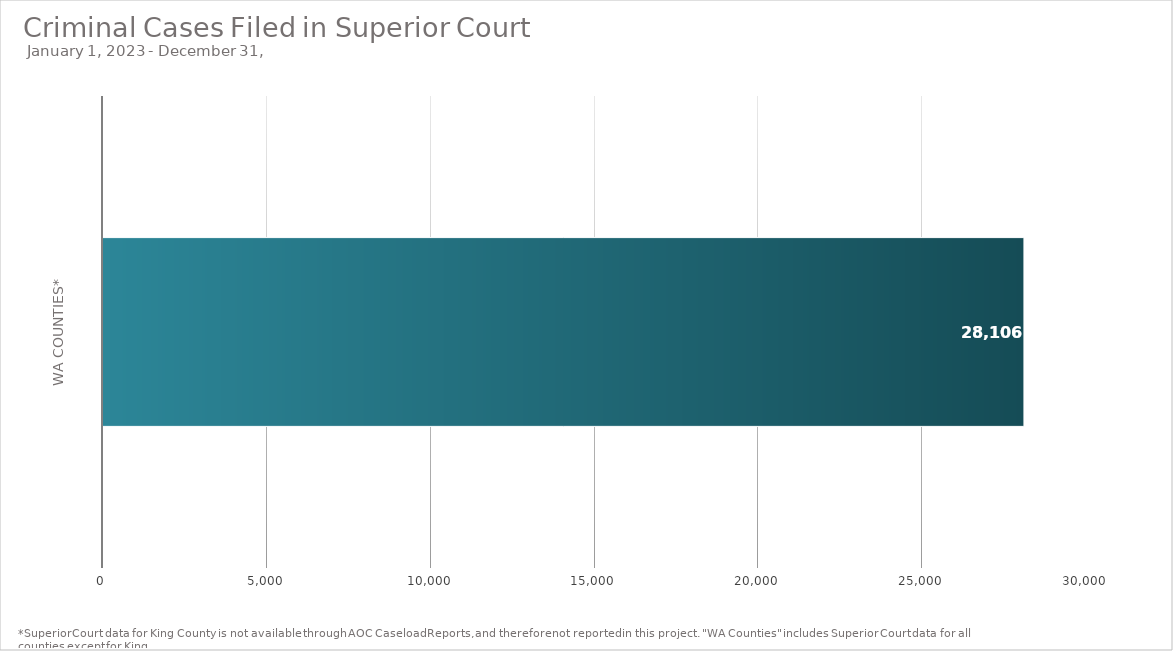
| Category | Total |
|---|---|
|  WA Counties* | 28106 |